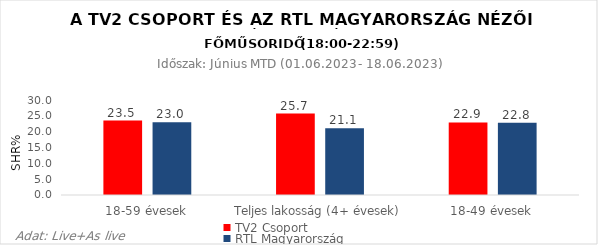
| Category | TV2 Csoport | RTL Magyarország |
|---|---|---|
| 18-59 évesek | 23.5 | 23 |
| Teljes lakosság (4+ évesek) | 25.7 | 21.1 |
| 18-49 évesek | 22.9 | 22.8 |